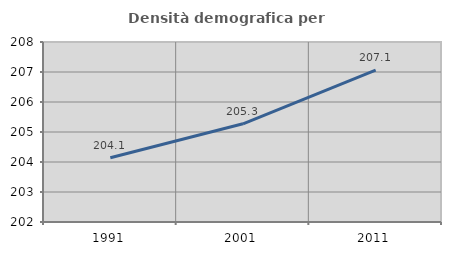
| Category | Densità demografica |
|---|---|
| 1991.0 | 204.14 |
| 2001.0 | 205.274 |
| 2011.0 | 207.063 |